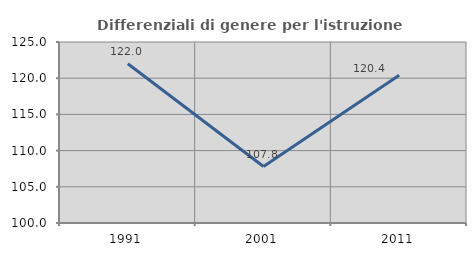
| Category | Differenziali di genere per l'istruzione superiore |
|---|---|
| 1991.0 | 121.994 |
| 2001.0 | 107.801 |
| 2011.0 | 120.408 |